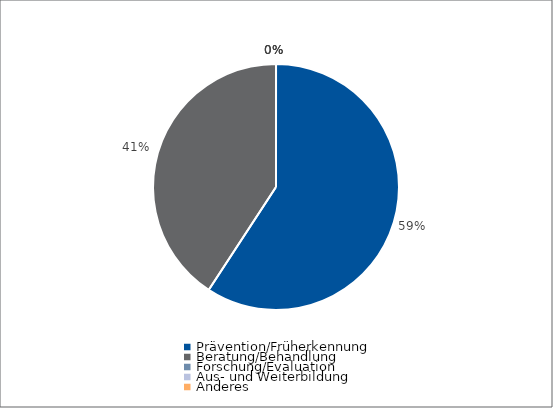
| Category | Series 0 |
|---|---|
| Prävention/Früherkennung | 55160 |
| Beratung/Behandlung | 37991.5 |
| Forschung/Evaluation | 0 |
| Aus- und Weiterbildung | 0 |
| Anderes | 0 |